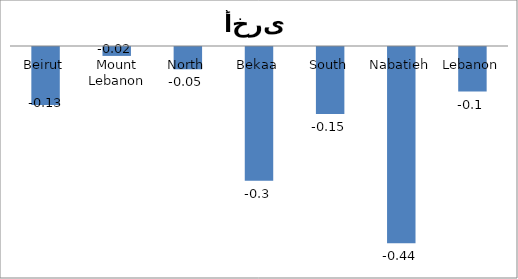
| Category | 04 |
|---|---|
| Beirut | -0.13 |
| Mount Lebanon | -0.02 |
| North | -0.05 |
| Bekaa | -0.3 |
| South | -0.15 |
| Nabatieh | -0.44 |
| Lebanon | -0.1 |